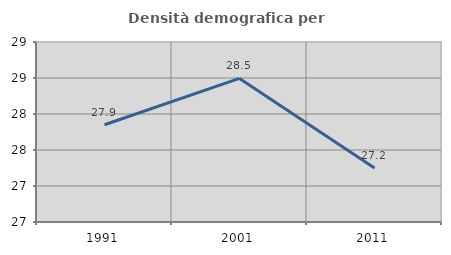
| Category | Densità demografica |
|---|---|
| 1991.0 | 27.851 |
| 2001.0 | 28.494 |
| 2011.0 | 27.25 |